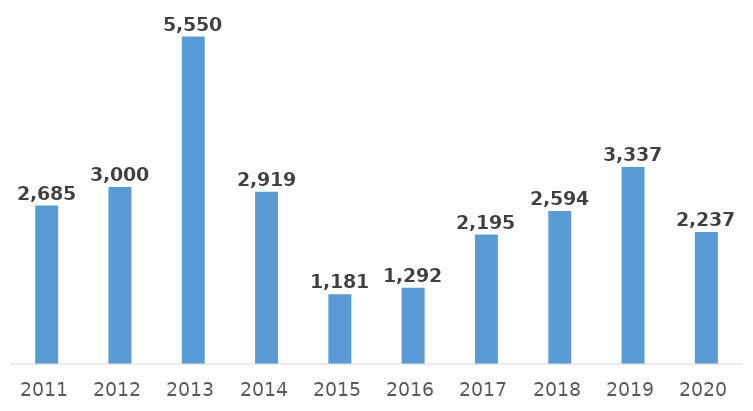
| Category | Interessi passivi sui conti di tesoreria |
|---|---|
| 2011.0 | 2684.787 |
| 2012.0 | 3000 |
| 2013.0 | 5550 |
| 2014.0 | 2919.432 |
| 2015.0 | 1181.156 |
| 2016.0 | 1292.429 |
| 2017.0 | 2194.788 |
| 2018.0 | 2593.733 |
| 2019.0 | 3337.116 |
| 2020.0 | 2236.729 |